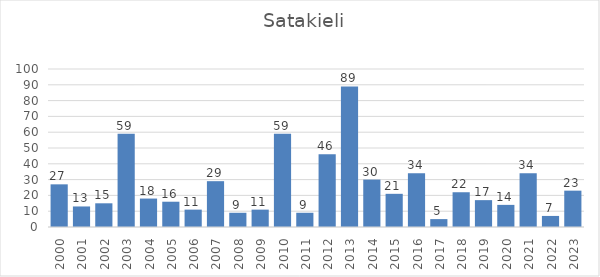
| Category | Series 0 |
|---|---|
| 2000.0 | 27 |
| 2001.0 | 13 |
| 2002.0 | 15 |
| 2003.0 | 59 |
| 2004.0 | 18 |
| 2005.0 | 16 |
| 2006.0 | 11 |
| 2007.0 | 29 |
| 2008.0 | 9 |
| 2009.0 | 11 |
| 2010.0 | 59 |
| 2011.0 | 9 |
| 2012.0 | 46 |
| 2013.0 | 89 |
| 2014.0 | 30 |
| 2015.0 | 21 |
| 2016.0 | 34 |
| 2017.0 | 5 |
| 2018.0 | 22 |
| 2019.0 | 17 |
| 2020.0 | 14 |
| 2021.0 | 34 |
| 2022.0 | 7 |
| 2023.0 | 23 |